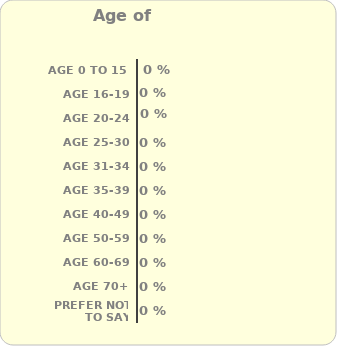
| Category | Series 0 |
|---|---|
| Age 0 to 15    | 0 |
| Age 16-19 | 0 |
| Age 20-24 | 0 |
| Age 25-30 | 0 |
| Age 31-34 | 0 |
| Age 35-39 | 0 |
| Age 40-49 | 0 |
| Age 50-59 | 0 |
| Age 60-69 | 0 |
| Age 70+ | 0 |
| prefer not to say | 0 |